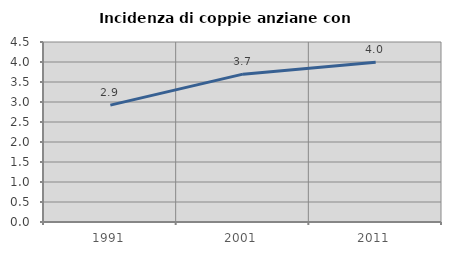
| Category | Incidenza di coppie anziane con figli |
|---|---|
| 1991.0 | 2.921 |
| 2001.0 | 3.696 |
| 2011.0 | 3.993 |